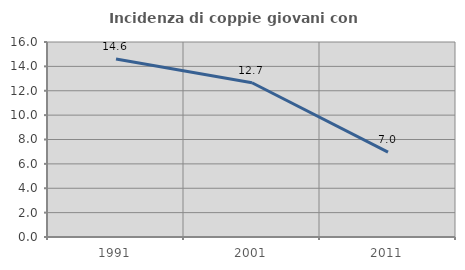
| Category | Incidenza di coppie giovani con figli |
|---|---|
| 1991.0 | 14.607 |
| 2001.0 | 12.658 |
| 2011.0 | 6.962 |